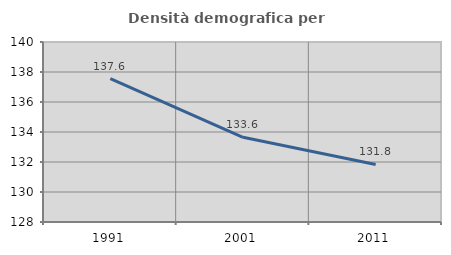
| Category | Densità demografica |
|---|---|
| 1991.0 | 137.554 |
| 2001.0 | 133.65 |
| 2011.0 | 131.837 |